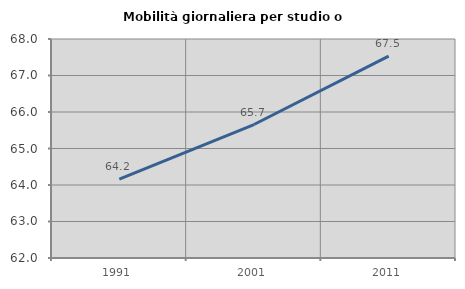
| Category | Mobilità giornaliera per studio o lavoro |
|---|---|
| 1991.0 | 64.163 |
| 2001.0 | 65.657 |
| 2011.0 | 67.531 |